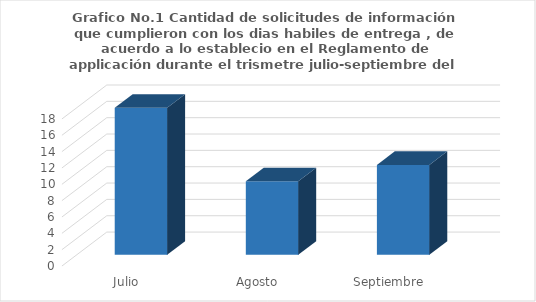
| Category | Series 0 |
|---|---|
| Julio | 18 |
| Agosto | 9 |
| Septiembre | 11 |